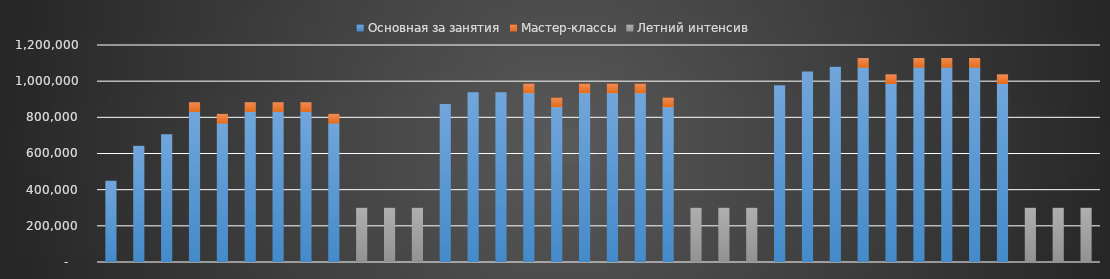
| Category | Основная за занятия | Мастер-классы | Летний интенсив |
|---|---|---|---|
| Сентябрь | 449925 | 0 | 0 |
| Октябрь | 642750 | 0 | 0 |
| Ноябрь | 707025 | 0 | 0 |
| Декабрь | 835575 | 48000 | 0 |
| Январь | 771300 | 48000 | 0 |
| Февраль | 835575 | 48000 | 0 |
| Март | 835575 | 48000 | 0 |
| Апрель | 835575 | 48000 | 0 |
| Май | 771300 | 48000 | 0 |
| Июнь | 0 | 0 | 300000 |
| Июль | 0 | 0 | 300000 |
| Август | 0 | 0 | 300000 |
| Сентябрь | 874140 | 0 | 0 |
| Октябрь | 938415 | 0 | 0 |
| Ноябрь | 938415 | 0 | 0 |
| Декабрь | 938415 | 48000 | 0 |
| Январь | 861285 | 48000 | 0 |
| Февраль | 938415 | 48000 | 0 |
| Март | 938415 | 48000 | 0 |
| Апрель | 938415 | 48000 | 0 |
| Май | 861285 | 48000 | 0 |
| Июнь | 0 | 0 | 300000 |
| Июль | 0 | 0 | 300000 |
| Август | 0 | 0 | 300000 |
| Сентябрь | 976980 | 0 | 0 |
| Октябрь | 1054110 | 0 | 0 |
| Ноябрь | 1079820 | 0 | 0 |
| Декабрь | 1079820 | 48000 | 0 |
| Январь | 989835 | 48000 | 0 |
| Февраль | 1079820 | 48000 | 0 |
| Март | 1079820 | 48000 | 0 |
| Апрель | 1079820 | 48000 | 0 |
| Май | 989835 | 48000 | 0 |
| Июнь | 0 | 0 | 300000 |
| Июль | 0 | 0 | 300000 |
| Август | 0 | 0 | 300000 |